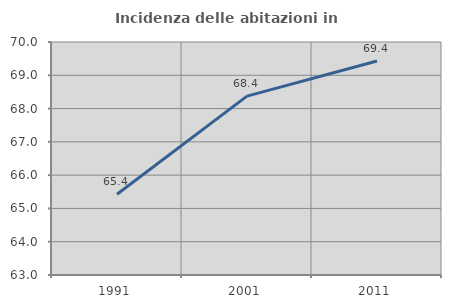
| Category | Incidenza delle abitazioni in proprietà  |
|---|---|
| 1991.0 | 65.426 |
| 2001.0 | 68.374 |
| 2011.0 | 69.429 |